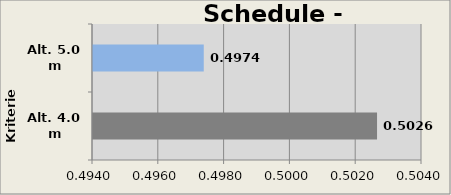
| Category | C. Foundation |
|---|---|
| Alt. 4.0 m | 0.503 |
| Alt. 5.0 m | 0.497 |